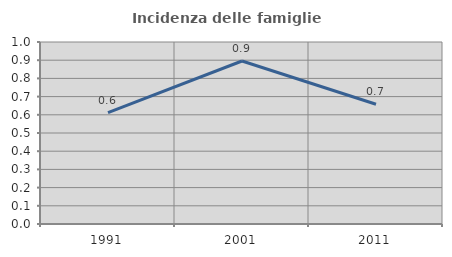
| Category | Incidenza delle famiglie numerose |
|---|---|
| 1991.0 | 0.612 |
| 2001.0 | 0.896 |
| 2011.0 | 0.658 |